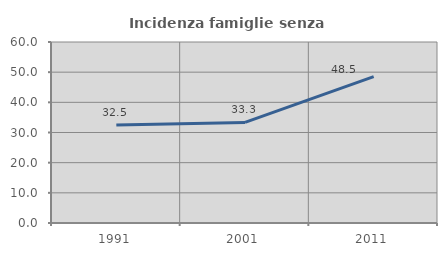
| Category | Incidenza famiglie senza nuclei |
|---|---|
| 1991.0 | 32.45 |
| 2001.0 | 33.333 |
| 2011.0 | 48.529 |